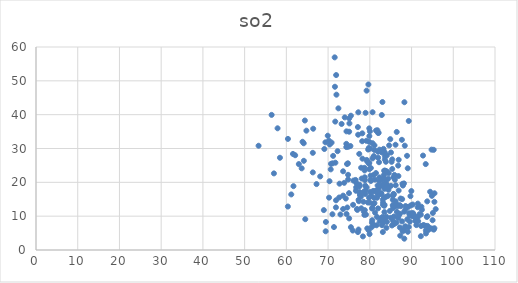
| Category | so2 |
|---|---|
| 78.58 | 11.326 |
| 77.63 | 16.284 |
| 78.56 | 17.21 |
| 85.52 | 16.003 |
| 83.36 | 21.3 |
| 83.6 | 26.735 |
| 79.85 | 31.955 |
| 80.14 | 29.954 |
| 80.9 | 27.486 |
| 87.69 | 32.566 |
| 86.85 | 21.862 |
| 86.0 | 20.784 |
| 83.76 | 23.302 |
| 89.09 | 24.152 |
| 88.92 | 27.838 |
| 93.4 | 25.394 |
| 84.54 | 22.7 |
| 78.9 | 19.028 |
| 77.38 | 14.42 |
| 82.29 | 18.822 |
| 87.36 | 15.21 |
| 83.46 | 13.062 |
| 86.51 | 11.24 |
| 85.95 | 12.945 |
| 86.38 | 8.057 |
| 92.48 | 11.892 |
| 94.45 | 17.208 |
| 87.75 | 15.04 |
| 81.21 | 17.368 |
| 77.47 | 28.402 |
| 76.79 | 19.77 |
| 71.88 | 12.595 |
| 80.4 | 6.707 |
| 80.98 | 15.44 |
| 78.05 | 21.12 |
| 74.75 | 25.62 |
| 79.38 | 26.185 |
| 80.65 | 31.57 |
| 77.52 | 19.308 |
| 79.02 | 17.692 |
| 81.86 | 19.068 |
| 79.74 | 25.565 |
| 85.22 | 26.062 |
| 81.98 | 29.035 |
| 78.24 | 26.988 |
| 86.21 | 19.132 |
| 89.86 | 13.208 |
| 82.98 | 20.828 |
| 83.43 | 23.425 |
| 71.75 | 25.8 |
| 70.63 | 23.828 |
| 87.81 | 19.57 |
| 81.47 | 22.735 |
| 85.07 | 18.962 |
| 86.91 | 17.568 |
| 83.89 | 20.552 |
| 79.88 | 25.72 |
| 80.9 | 22.174 |
| 85.37 | 23.948 |
| 80.27 | 20.408 |
| 80.61 | 12.422 |
| 85.91 | 22.185 |
| 84.09 | 27.965 |
| 85.37 | 26.792 |
| 83.63 | 27.66 |
| 79.66 | 48.925 |
| 81.97 | 34.62 |
| 82.3 | 29.66 |
| 80.65 | 27.063 |
| 80.66 | 40.717 |
| 71.64 | 48.25 |
| 77.24 | 40.698 |
| 83.28 | 29.316 |
| 89.95 | 17.426 |
| 88.57 | 12.998 |
| 82.27 | 16.478 |
| 83.4 | 22.198 |
| 78.75 | 23.518 |
| 81.99 | 27.276 |
| 80.96 | 27.764 |
| 80.24 | 24.232 |
| 83.51 | 19.516 |
| 81.12 | 30.918 |
| 79.88 | 23.89 |
| 80.21 | 20.818 |
| 76.59 | 20.708 |
| 77.97 | 12.322 |
| 74.61 | 12.563 |
| 81.62 | 17.648 |
| 86.79 | 24.948 |
| 86.16 | 31.106 |
| 79.6 | 29.696 |
| 74.37 | 31.378 |
| 70.21 | 32.308 |
| 83.69 | 18.498 |
| 83.39 | 15.545 |
| 84.05 | 19.432 |
| 84.47 | 17.785 |
| 81.89 | 16.702 |
| 79.26 | 26.62 |
| 79.87 | 35.95 |
| 78.17 | 32.152 |
| 74.79 | 22.222 |
| 75.47 | 39.69 |
| 79.23 | 47.1 |
| 82.87 | 39.897 |
| 84.63 | 30.915 |
| 81.83 | 35.382 |
| 75.35 | 30.733 |
| 84.37 | 16.008 |
| 89.58 | 8.378 |
| 83.62 | 23.47 |
| 84.07 | 23.257 |
| 81.49 | 35.31 |
| 71.58 | 56.938 |
| 82.96 | 19.21 |
| 85.66 | 21.482 |
| 64.43 | 38.272 |
| 63.88 | 31.99 |
| 75.06 | 38.894 |
| 74.41 | 35.068 |
| 71.72 | 37.952 |
| 78.2 | 34.48 |
| 85.5 | 13.238 |
| 82.1 | 18.076 |
| 83.85 | 26.076 |
| 82.51 | 29.384 |
| 81.12 | 29.54 |
| 84.9 | 32.762 |
| 82.27 | 20.39 |
| 82.7 | 16.794 |
| 79.16 | 32.278 |
| 83.28 | 29.894 |
| 83.53 | 18.066 |
| 78.72 | 24.29 |
| 82.12 | 34.626 |
| 82.21 | 25.942 |
| 80.18 | 21.968 |
| 77.14 | 36.338 |
| 72.47 | 41.868 |
| 66.43 | 35.846 |
| 76.07 | 20.518 |
| 84.41 | 21.068 |
| 91.48 | 12.632 |
| 93.66 | 9.768 |
| 88.38 | 30.838 |
| 82.93 | 28.804 |
| 92.75 | 27.908 |
| 83.53 | 13.36 |
| 93.76 | 14.378 |
| 89.74 | 15.904 |
| 87.93 | 19.052 |
| 85.07 | 28.82 |
| 88.29 | 43.675 |
| 89.33 | 38.135 |
| 94.8 | 29.66 |
| 83.59 | 28.808 |
| 67.23 | 19.482 |
| 60.36 | 12.85 |
| 75.11 | 37.412 |
| 83.02 | 43.738 |
| 71.93 | 51.71 |
| 79.89 | 33.672 |
| 78.99 | 40.542 |
| 88.19 | 19.676 |
| 89.59 | 10.124 |
| 68.11 | 21.742 |
| 73.99 | 39.194 |
| 86.45 | 34.892 |
| 77.2 | 34.072 |
| 95.31 | 29.61 |
| 79.76 | 30.162 |
| 74.54 | 25.422 |
| 70.38 | 31.17 |
| 69.92 | 33.78 |
| 72.0 | 45.906 |
| 64.8 | 35.272 |
| 80.02 | 35.078 |
| 94.88 | 16.012 |
| 95.11 | 10.946 |
| 95.5 | 16.766 |
| 95.48 | 14.24 |
| 77.92 | 24.305 |
| 66.34 | 22.935 |
| 71.08 | 25.618 |
| 86.3 | 13.654 |
| 78.48 | 14.262 |
| 83.21 | 18.812 |
| 80.78 | 17.44 |
| 77.51 | 17.132 |
| 74.37 | 30.427 |
| 75.01 | 16.798 |
| 88.97 | 9.04 |
| 75.05 | 9.342 |
| 71.21 | 27.814 |
| 73.24 | 37.257 |
| 72.28 | 29.21 |
| 86.92 | 26.665 |
| 91.51 | 13.705 |
| 72.66 | 15.515 |
| 80.08 | 17.125 |
| 90.29 | 13.44 |
| 79.24 | 18.495 |
| 81.73 | 15.447 |
| 85.51 | 14.817 |
| 82.0 | 16.29 |
| 81.25 | 11.055 |
| 79.79 | 15.468 |
| 75.05 | 34.963 |
| 70.84 | 31.737 |
| 66.34 | 28.718 |
| 58.46 | 27.263 |
| 64.16 | 31.547 |
| 70.7 | 25.467 |
| 61.7 | 18.867 |
| 76.67 | 17.507 |
| 94.87 | 6.327 |
| 86.6 | 12.902 |
| 73.86 | 19.857 |
| 93.46 | 4.884 |
| 88.26 | 3.346 |
| 83.4 | 8.274 |
| 80.34 | 16.038 |
| 74.79 | 20.834 |
| 82.8 | 16.6 |
| 78.83 | 20.652 |
| 69.1 | 29.85 |
| 60.38 | 32.836 |
| 62.11 | 28.008 |
| 63.67 | 24.135 |
| 57.02 | 22.642 |
| 61.18 | 16.425 |
| 88.23 | 11.33 |
| 85.77 | 16.456 |
| 92.28 | 7.104 |
| 89.11 | 5.382 |
| 80.56 | 12.248 |
| 81.11 | 13.856 |
| 78.78 | 21.498 |
| 69.36 | 31.822 |
| 74.83 | 30.508 |
| 82.31 | 21.465 |
| 71.9 | 14.698 |
| 62.99 | 25.395 |
| 57.89 | 35.97 |
| 56.47 | 39.937 |
| 61.58 | 28.395 |
| 82.25 | 18.844 |
| 82.67 | 9.376 |
| 80.51 | 8.1 |
| 64.19 | 26.36 |
| 53.34 | 30.812 |
| 91.15 | 7.358 |
| 90.51 | 10.33 |
| 84.46 | 18.494 |
| 70.23 | 15.468 |
| 79.39 | 6.39 |
| 95.48 | 6.436 |
| 83.16 | 14.002 |
| 77.52 | 18.772 |
| 85.64 | 13.112 |
| 83.17 | 13.306 |
| 95.33 | 6.02 |
| 87.29 | 4.234 |
| 92.23 | 4.078 |
| 87.41 | 12.943 |
| 73.61 | 16.068 |
| 88.55 | 11.965 |
| 95.04 | 8.803 |
| 90.89 | 8.573 |
| 81.73 | 9.767 |
| 92.22 | 10.452 |
| 89.41 | 10.852 |
| 93.84 | 7.124 |
| 74.43 | 10.64 |
| 87.17 | 13.268 |
| 78.8 | 11.784 |
| 68.98 | 11.792 |
| 92.97 | 7.248 |
| 91.49 | 9.678 |
| 92.36 | 12.796 |
| 83.86 | 15.69 |
| 73.6 | 23.266 |
| 78.7 | 10.368 |
| 79.08 | 10.462 |
| 76.94 | 12.11 |
| 83.98 | 9.854 |
| 77.31 | 14.832 |
| 91.12 | 9.7 |
| 91.59 | 8.514 |
| 85.02 | 9.518 |
| 85.31 | 7.25 |
| 94.03 | 5.912 |
| 95.79 | 12.08 |
| 88.52 | 6.962 |
| 87.88 | 5.495 |
| 75.99 | 13.355 |
| 85.64 | 16.574 |
| 88.25 | 5.872 |
| 82.37 | 8.465 |
| 74.24 | 15.222 |
| 72.74 | 19.6 |
| 89.33 | 6.787 |
| 85.8 | 7.642 |
| 81.63 | 7.31 |
| 75.91 | 5.754 |
| 80.58 | 8.82 |
| 89.97 | 10.9 |
| 90.18 | 10.016 |
| 81.97 | 12.302 |
| 86.81 | 9.424 |
| 83.98 | 6.542 |
| 72.96 | 10.506 |
| 81.23 | 20.82 |
| 70.34 | 20.328 |
| 73.6 | 12.114 |
| 79.52 | 14.035 |
| 90.09 | 10.567 |
| 93.37 | 7.153 |
| 93.43 | 5.737 |
| 92.83 | 7.367 |
| 94.42 | 6.47 |
| 93.81 | 9.97 |
| 89.25 | 12.765 |
| 79.98 | 14.035 |
| 84.09 | 8.295 |
| 87.86 | 5.852 |
| 85.8 | 9.915 |
| 87.73 | 8.45 |
| 85.59 | 8.558 |
| 85.59 | 12.395 |
| 90.74 | 9.71 |
| 83.5 | 11.205 |
| 83.44 | 8.5 |
| 87.22 | 10.7 |
| 88.49 | 6.925 |
| 77.86 | 15.788 |
| 91.9 | 10.588 |
| 76.72 | 18.498 |
| 78.89 | 16.562 |
| 83.08 | 9.788 |
| 86.93 | 10.245 |
| 80.81 | 13.52 |
| 77.76 | 16.04 |
| 83.11 | 14.892 |
| 86.19 | 14.382 |
| 87.2 | 6.652 |
| 79.73 | 5.8 |
| 80.95 | 7.337 |
| 84.79 | 11.53 |
| 83.72 | 9.483 |
| 90.38 | 10.882 |
| 77.0 | 11.85 |
| 71.04 | 10.565 |
| 77.29 | 6.05 |
| 69.47 | 8.282 |
| 64.53 | 9.108 |
| 82.92 | 7.334 |
| 83.12 | 5.31 |
| 77.15 | 5.302 |
| 69.42 | 5.528 |
| 78.35 | 4.02 |
| 75.47 | 6.748 |
| 71.41 | 6.775 |
| 79.94 | 4.708 |